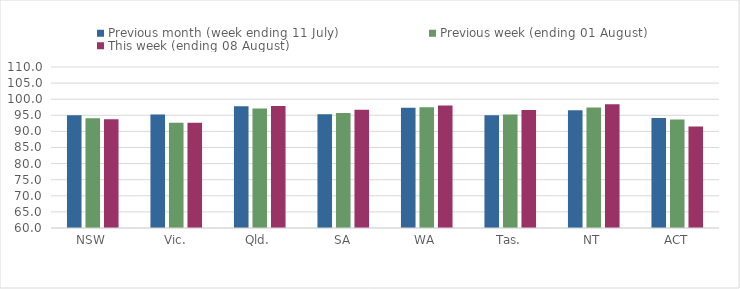
| Category | Previous month (week ending 11 July) | Previous week (ending 01 August) | This week (ending 08 August) |
|---|---|---|---|
| NSW | 94.978 | 94.083 | 93.785 |
| Vic. | 95.262 | 92.658 | 92.699 |
| Qld. | 97.822 | 97.097 | 97.893 |
| SA | 95.322 | 95.713 | 96.685 |
| WA | 97.307 | 97.529 | 98.035 |
| Tas. | 95.034 | 95.224 | 96.678 |
| NT | 96.54 | 97.438 | 98.403 |
| ACT | 94.13 | 93.698 | 91.534 |